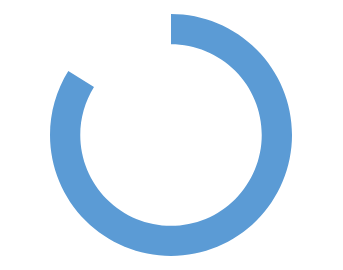
| Category | Series 0 |
|---|---|
| 0 | 52 |
| 1 | 10 |